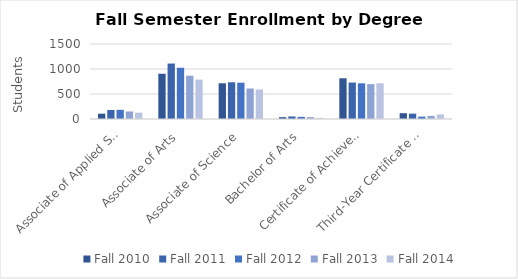
| Category | Fall 2010 | Fall 2011 | Fall 2012 | Fall 2013 | Fall 2014 |
|---|---|---|---|---|---|
| Associate of Applied Science | 106 | 180 | 183 | 151 | 127 |
| Associate of Arts | 905 | 1109 | 1025 | 866 | 788 |
| Associate of Science | 715 | 735 | 726 | 610 | 591 |
| Bachelor of Arts | 37 | 51 | 43 | 37 | 22 |
| Certificate of Achievement | 814 | 729 | 714 | 698 | 715 |
| Third-Year Certificate of Achievement | 116 | 107 | 47 | 62 | 91 |